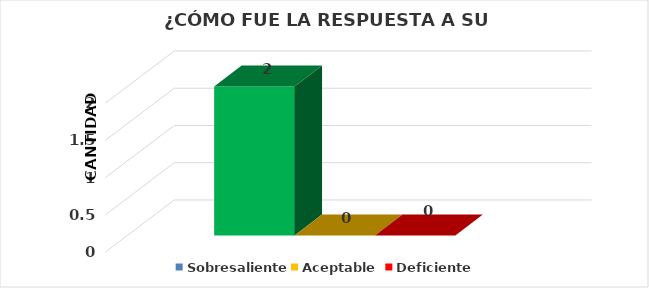
| Category | Sobresaliente | Aceptable  | Deficiente |
|---|---|---|---|
| 0 | 2 | 0 | 0 |